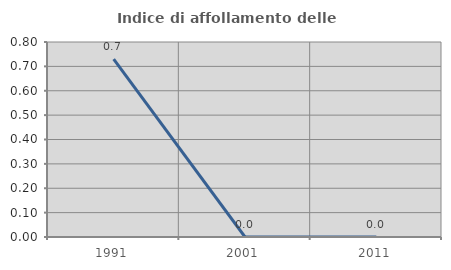
| Category | Indice di affollamento delle abitazioni  |
|---|---|
| 1991.0 | 0.73 |
| 2001.0 | 0 |
| 2011.0 | 0 |